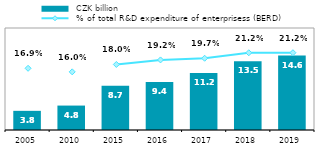
| Category |  CZK billion |
|---|---|
| 2005 | 3.758 |
| 2010 | 4.79 |
| 2015 | 8.661 |
| 2016 | 9.421 |
| 2017 | 11.19 |
| 2018 | 13.495 |
| 2019 | 14.6 |